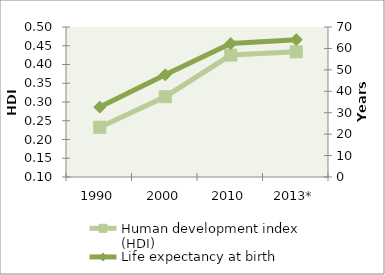
| Category | Human development index (HDI) |
|---|---|
| 1990 | 0.233 |
| 2000 | 0.314 |
| 2010 | 0.425 |
| 2013* | 0.434 |